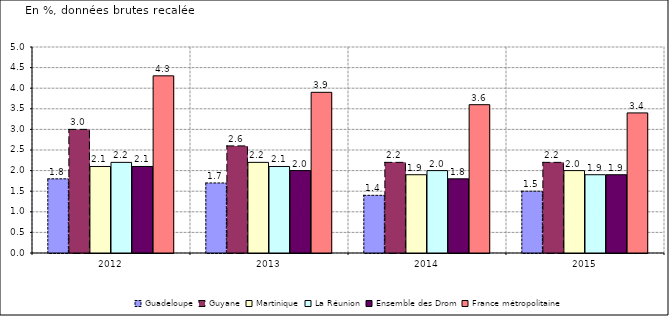
| Category | Guadeloupe | Guyane | Martinique | La Réunion | Ensemble des Drom | France métropolitaine |
|---|---|---|---|---|---|---|
| 2012.0 | 1.8 | 3 | 2.1 | 2.2 | 2.1 | 4.3 |
| 2013.0 | 1.7 | 2.6 | 2.2 | 2.1 | 2 | 3.9 |
| 2014.0 | 1.4 | 2.2 | 1.9 | 2 | 1.8 | 3.6 |
| 2015.0 | 1.5 | 2.2 | 2 | 1.9 | 1.9 | 3.4 |